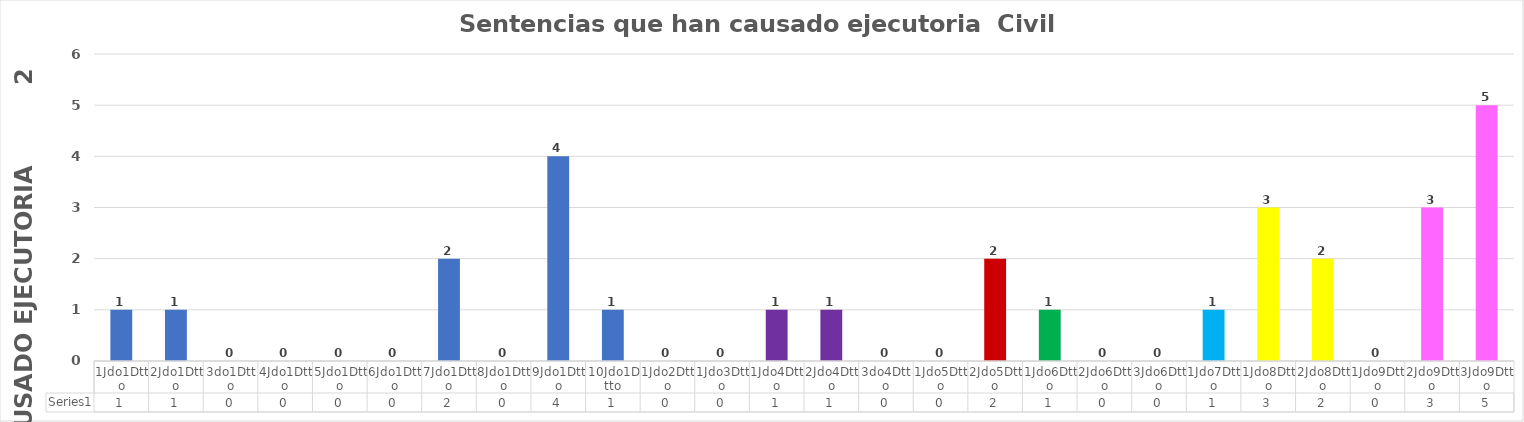
| Category | Series 0 |
|---|---|
| 1Jdo1Dtto | 1 |
| 2Jdo1Dtto | 1 |
| 3do1Dtto | 0 |
| 4Jdo1Dtto | 0 |
| 5Jdo1Dtto | 0 |
| 6Jdo1Dtto | 0 |
| 7Jdo1Dtto | 2 |
| 8Jdo1Dtto | 0 |
| 9Jdo1Dtto | 4 |
| 10Jdo1Dtto | 1 |
| 1Jdo2Dtto | 0 |
| 1Jdo3Dtto | 0 |
| 1Jdo4Dtto | 1 |
| 2Jdo4Dtto | 1 |
| 3do4Dtto | 0 |
| 1Jdo5Dtto | 0 |
| 2Jdo5Dtto | 2 |
| 1Jdo6Dtto | 1 |
| 2Jdo6Dtto | 0 |
| 3Jdo6Dtto | 0 |
| 1Jdo7Dtto | 1 |
| 1Jdo8Dtto | 3 |
| 2Jdo8Dtto | 2 |
| 1Jdo9Dtto | 0 |
| 2Jdo9Dtto | 3 |
| 3Jdo9Dtto | 5 |